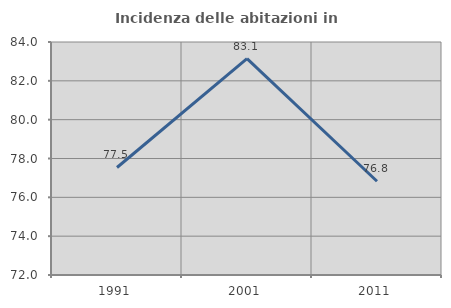
| Category | Incidenza delle abitazioni in proprietà  |
|---|---|
| 1991.0 | 77.537 |
| 2001.0 | 83.14 |
| 2011.0 | 76.828 |